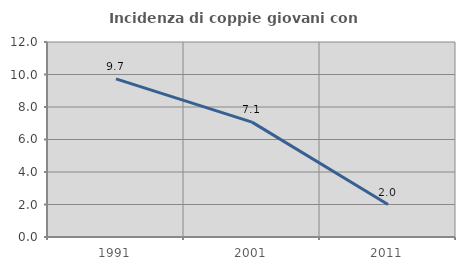
| Category | Incidenza di coppie giovani con figli |
|---|---|
| 1991.0 | 9.735 |
| 2001.0 | 7.071 |
| 2011.0 | 2 |